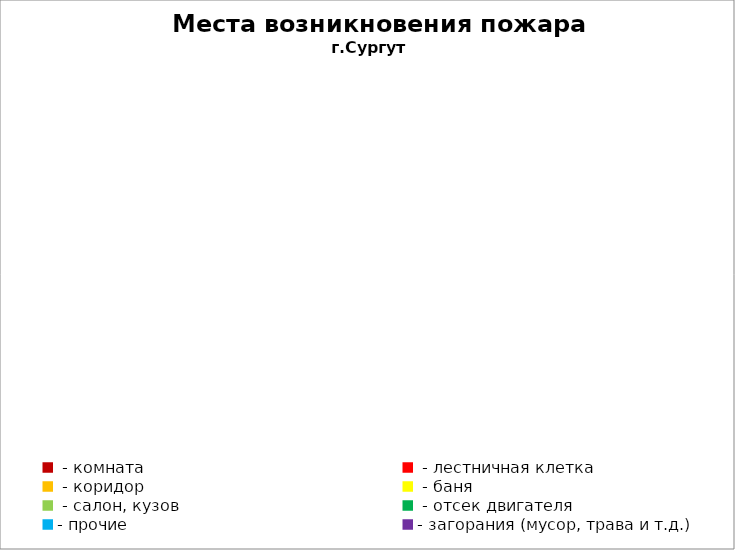
| Category | Места возникновения пожара |
|---|---|
|  - комната | 41 |
|  - лестничная клетка | 4 |
|  - коридор | 3 |
|  - баня | 11 |
|  - салон, кузов | 10 |
|  - отсек двигателя | 18 |
| - прочие | 48 |
| - загорания (мусор, трава и т.д.)  | 41 |